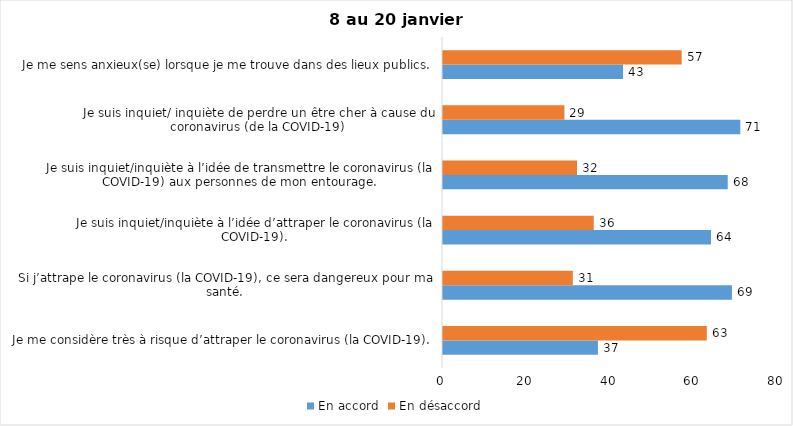
| Category | En accord | En désaccord |
|---|---|---|
| Je me considère très à risque d’attraper le coronavirus (la COVID-19). | 37 | 63 |
| Si j’attrape le coronavirus (la COVID-19), ce sera dangereux pour ma santé. | 69 | 31 |
| Je suis inquiet/inquiète à l’idée d’attraper le coronavirus (la COVID-19). | 64 | 36 |
| Je suis inquiet/inquiète à l’idée de transmettre le coronavirus (la COVID-19) aux personnes de mon entourage. | 68 | 32 |
| Je suis inquiet/ inquiète de perdre un être cher à cause du coronavirus (de la COVID-19) | 71 | 29 |
| Je me sens anxieux(se) lorsque je me trouve dans des lieux publics. | 43 | 57 |